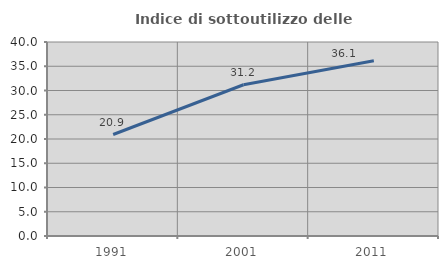
| Category | Indice di sottoutilizzo delle abitazioni  |
|---|---|
| 1991.0 | 20.926 |
| 2001.0 | 31.185 |
| 2011.0 | 36.148 |